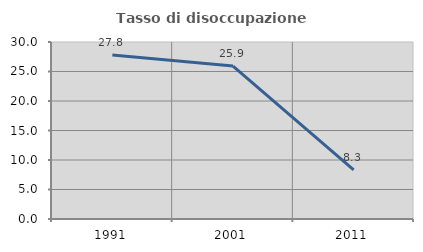
| Category | Tasso di disoccupazione giovanile  |
|---|---|
| 1991.0 | 27.778 |
| 2001.0 | 25.926 |
| 2011.0 | 8.333 |